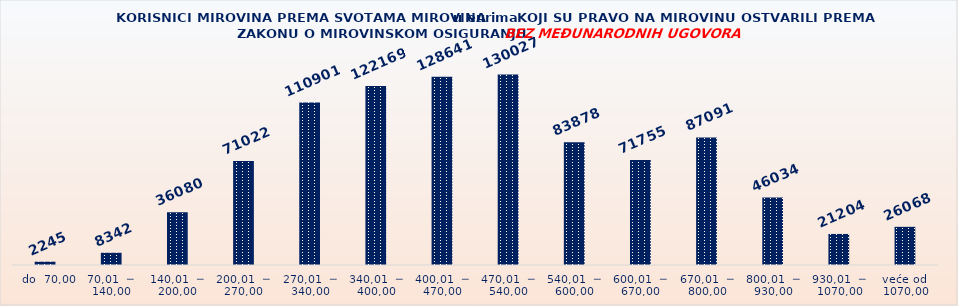
| Category | KORISNICI MIROVINA PREMA VRSTAMA I SVOTAMA MIROVINA KOJI SU PRAVO NA MIROVINU OSTVARILI PREMA ZAKONU O MIROVINSKOM OSIGURANJU 
BEZ MEĐUNARODNIH UGOVORA |
|---|---|
|   do  70,00 | 2245 |
| 70,01  ─  140,00 | 8342 |
| 140,01  ─  200,00 | 36080 |
| 200,01  ─  270,00 | 71022 |
| 270,01  ─  340,00 | 110901 |
| 340,01  ─  400,00 | 122169 |
| 400,01  ─  470,00 | 128641 |
| 470,01  ─  540,00 | 130027 |
| 540,01  ─  600,00 | 83878 |
| 600,01  ─  670,00 | 71755 |
| 670,01  ─  800,00 | 87091 |
| 800,01  ─  930,00 | 46034 |
| 930,01  ─  1070,00 | 21204 |
| veće od  1070,00 | 26068 |